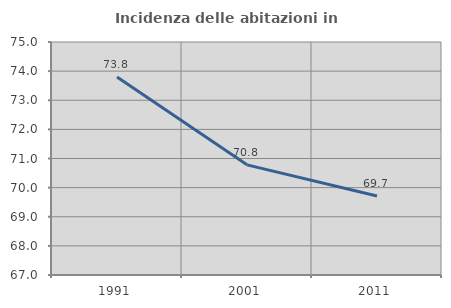
| Category | Incidenza delle abitazioni in proprietà  |
|---|---|
| 1991.0 | 73.795 |
| 2001.0 | 70.782 |
| 2011.0 | 69.71 |